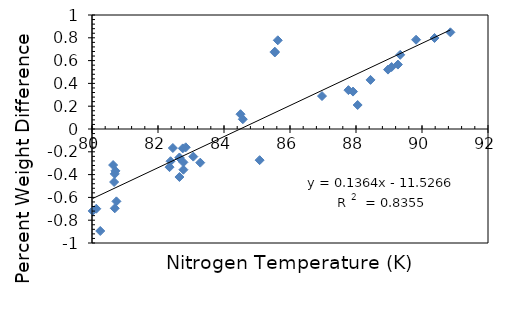
| Category | Series 0 |
|---|---|
| 80.02 | -0.719 |
| 80.13 | -0.699 |
| 80.25 | -0.895 |
| 80.64 | -0.316 |
| 80.67 | -0.465 |
| 80.69 | -0.696 |
| 80.69 | -0.394 |
| 80.71 | -0.367 |
| 80.74 | -0.635 |
| 82.35 | -0.335 |
| 82.38 | -0.283 |
| 82.45 | -0.167 |
| 82.65 | -0.254 |
| 82.65 | -0.421 |
| 82.65 | -0.25 |
| 82.75 | -0.17 |
| 82.77 | -0.357 |
| 82.77 | -0.292 |
| 82.84 | -0.161 |
| 83.07 | -0.242 |
| 83.28 | -0.295 |
| 84.5 | 0.13 |
| 84.57 | 0.086 |
| 85.08 | -0.273 |
| 85.54 | 0.671 |
| 85.54 | 0.678 |
| 85.63 | 0.778 |
| 86.97 | 0.289 |
| 87.77 | 0.341 |
| 87.91 | 0.328 |
| 88.05 | 0.21 |
| 88.44 | 0.431 |
| 88.97 | 0.521 |
| 89.08 | 0.544 |
| 89.27 | 0.565 |
| 89.34 | 0.651 |
| 89.82 | 0.783 |
| 90.38 | 0.798 |
| 90.86 | 0.848 |